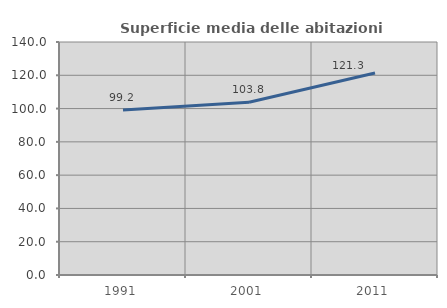
| Category | Superficie media delle abitazioni occupate |
|---|---|
| 1991.0 | 99.206 |
| 2001.0 | 103.774 |
| 2011.0 | 121.338 |